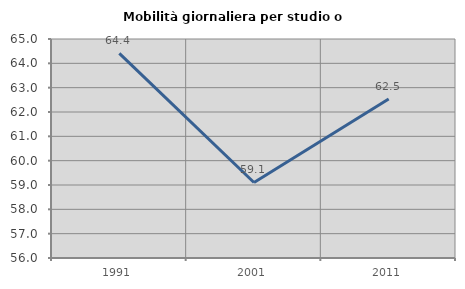
| Category | Mobilità giornaliera per studio o lavoro |
|---|---|
| 1991.0 | 64.411 |
| 2001.0 | 59.104 |
| 2011.0 | 62.536 |